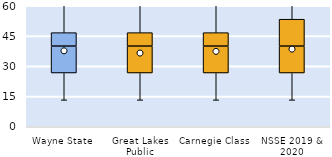
| Category | 25th | 50th | 75th |
|---|---|---|---|
| Wayne State | 26.667 | 13.333 | 6.667 |
| Great Lakes Public | 26.667 | 13.333 | 6.667 |
| Carnegie Class | 26.667 | 13.333 | 6.667 |
| NSSE 2019 & 2020 | 26.667 | 13.333 | 13.333 |